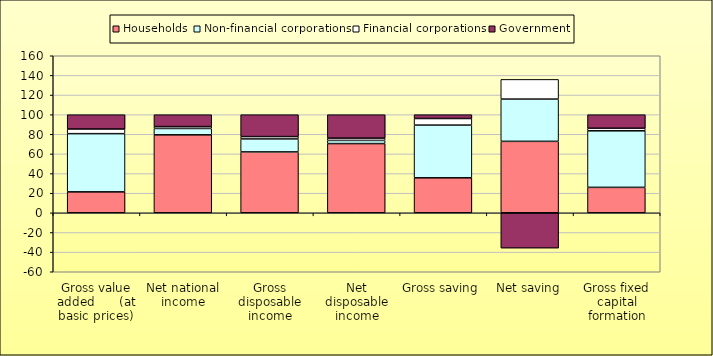
| Category | Households | Non-financial corporations | Financial corporations | Government |
|---|---|---|---|---|
| Gross value added      (at basic prices) | 21.38 | 59.28 | 4.74 | 14.59 |
| Net national income | 79.47 | 6.48 | 1.92 | 12.12 |
| Gross disposable income | 62.06 | 13.2 | 2.42 | 22.32 |
| Net disposable income | 70.55 | 3.22 | 2.36 | 23.86 |
| Gross saving | 35.69 | 53.68 | 6.73 | 3.91 |
| Net saving | 72.83 | 43.03 | 20.06 | -35.92 |
| Gross fixed capital formation | 25.96 | 57.6 | 2.62 | 13.82 |